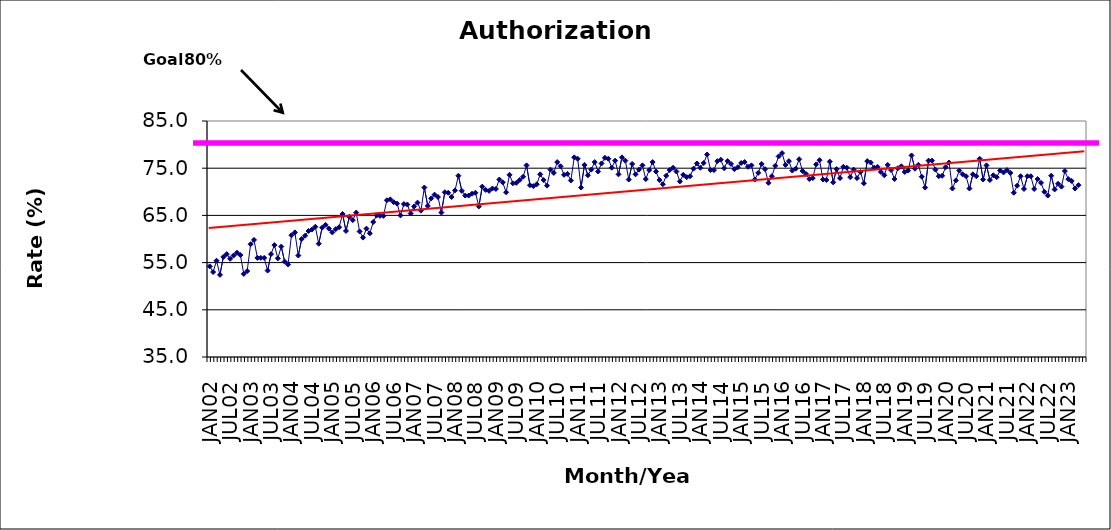
| Category | Series 0 |
|---|---|
| JAN02 | 54.2 |
| FEB02 | 53 |
| MAR02 | 55.4 |
| APR02 | 52.4 |
| MAY02 | 56.2 |
| JUN02 | 56.8 |
| JUL02 | 55.8 |
| AUG02 | 56.5 |
| SEP02 | 57.1 |
| OCT02 | 56.6 |
| NOV02 | 52.6 |
| DEC02 | 53.2 |
| JAN03 | 58.9 |
| FEB03 | 59.8 |
| MAR03 | 56 |
| APR03 | 56 |
| MAY03 | 56 |
| JUN03 | 53.3 |
| JUL03 | 56.8 |
| AUG03 | 58.7 |
| SEP03 | 55.9 |
| OCT03 | 58.4 |
| NOV03 | 55.2 |
| DEC03 | 54.6 |
| JAN04 | 60.8 |
| FEB04 | 61.4 |
| MAR04 | 56.5 |
| APR04 | 60 |
| MAY04 | 60.7 |
| JUN04 | 61.7 |
| JUL04 | 62 |
| AUG04 | 62.6 |
| SEP04 | 59 |
| OCT04 | 62.4 |
| NOV04 | 63 |
| DEC04 | 62.2 |
| JAN05 | 61.4 |
| FEB05 | 62.1 |
| MAR05 | 62.5 |
| APR05 | 65.3 |
| MAY05 | 61.7 |
| JUN05 | 64.7 |
| JUL05 | 64 |
| AUG05 | 65.6 |
| SEP05 | 61.6 |
| OCT05 | 60.3 |
| NOV05 | 62.2 |
| DEC05 | 61.2 |
| JAN06 | 63.6 |
| FEB06 | 65 |
| MAR06 | 64.9 |
| APR06 | 64.9 |
| MAY06 | 68.2 |
| JUN06 | 68.4 |
| JUL06 | 67.8 |
| AUG06 | 67.5 |
| SEP06 | 65 |
| OCT06 | 67.4 |
| NOV06 | 67.3 |
| DEC06 | 65.4 |
| JAN07 | 66.9 |
| FEB07 | 67.7 |
| MAR07 | 66 |
| APR07 | 70.9 |
| MAY07 | 67 |
| JUN07 | 68.6 |
| JUL07 | 69.4 |
| AUG07 | 68.9 |
| SEP07 | 65.6 |
| OCT07 | 69.9 |
| NOV07 | 69.8 |
| DEC07 | 68.9 |
| JAN08 | 70.3 |
| FEB08 | 73.4 |
| MAR08 | 70.2 |
| APR08 | 69.2 |
| MAY08 | 69.2 |
| JUN08 | 69.6 |
| JUL08 | 69.8 |
| AUG08 | 66.9 |
| SEP08 | 71.1 |
| OCT08 | 70.4 |
| NOV08 | 70.2 |
| DEC08 | 70.7 |
| JAN09 | 70.6 |
| FEB09 | 72.6 |
| MAR09 | 72 |
| APR09 | 69.9 |
| MAY09 | 73.6 |
| JUN09 | 71.8 |
| JUL09 | 71.9 |
| AUG09 | 72.5 |
| SEP09 | 73.2 |
| OCT09 | 75.6 |
| NOV09 | 71.4 |
| DEC09 | 71.2 |
| JAN10 | 71.6 |
| FEB10 | 73.7 |
| MAR10 | 72.5 |
| APR10 | 71.3 |
| MAY10 | 74.7 |
| JUN10 | 74 |
| JUL10 | 76.3 |
| AUG10 | 75.4 |
| SEP10 | 73.6 |
| OCT10 | 73.8 |
| NOV10 | 72.4 |
| DEC10 | 77.3 |
| JAN11 | 77 |
| FEB11 | 70.9 |
| MAR11 | 75.7 |
| APR11 | 73.5 |
| MAY11 | 74.7 |
| JUN11 | 76.3 |
| JUL11 | 74.3 |
| AUG11 | 76 |
| SEP11 | 77.2 |
| OCT11 | 77 |
| NOV11 | 75.1 |
| DEC11 | 76.6 |
| JAN12 | 73.7 |
| FEB12 | 77.3 |
| MAR12 | 76.6 |
| APR12 | 72.6 |
| MAY12 | 75.9 |
| JUN12 | 73.7 |
| JUL12 | 74.7 |
| AUG12 | 75.6 |
| SEP12 | 72.7 |
| OCT12 | 74.6 |
| NOV12 | 76.3 |
| DEC12 | 74.3 |
| JAN13 | 72.5 |
| FEB13 | 71.6 |
| MAR13 | 73.4 |
| APR13 | 74.6 |
| MAY13 | 75.1 |
| JUN13 | 74.3 |
| JUL13 | 72.2 |
| AUG13 | 73.6 |
| SEP13 | 73.1 |
| OCT13 | 73.3 |
| NOV13 | 74.9 |
| DEC13 | 76 |
| JAN14 | 75.1 |
| FEB14 | 76.1 |
| MAR14 | 77.9 |
| APR14 | 74.6 |
| MAY14 | 74.6 |
| JUN14 | 76.5 |
| JUL14 | 76.8 |
| AUG14 | 75 |
| SEP14 | 76.5 |
| OCT14 | 75.9 |
| NOV14 | 74.8 |
| DEC14 | 75.2 |
| JAN15 | 76.1 |
| FEB15 | 76.3 |
| MAR15 | 75.3 |
| APR15 | 75.6 |
| MAY15 | 72.6 |
| JUN15 | 74 |
| JUL15 | 75.9 |
| AUG15 | 74.8 |
| SEP15 | 71.9 |
| OCT15 | 73.3 |
| NOV15 | 75.5 |
| DEC15 | 77.5 |
| JAN16 | 78.2 |
| FEB16 | 75.7 |
| MAR16 | 76.5 |
| APR16 | 74.5 |
| MAY16 | 74.9 |
| JUN16 | 76.9 |
| JUL16 | 74.4 |
| AUG16 | 73.8 |
| SEP16 | 72.7 |
| OCT16 | 72.9 |
| NOV16 | 75.8 |
| DEC16 | 76.7 |
| JAN17 | 72.6 |
| FEB17 | 72.5 |
| MAR17 | 76.4 |
| APR17 | 72 |
| MAY17 | 74.8 |
| JUN17 | 72.9 |
| JUL17 | 75.3 |
| AUG17 | 75.1 |
| SEP17 | 73.1 |
| OCT17 | 74.7 |
| NOV17 | 72.9 |
| DEC17 | 74.2 |
| JAN18 | 71.8 |
| FEB18 | 76.5 |
| MAR18 | 76.2 |
| APR18 | 75.1 |
| MAY18 | 75.3 |
| JUN18 | 74.2 |
| JUL18 | 73.5 |
| AUG18 | 75.7 |
| SEP18 | 74.6 |
| OCT18 | 72.7 |
| NOV18 | 75 |
| DEC18 | 75.4 |
| JAN19 | 74.2 |
| FEB19 | 74.5 |
| MAR19 | 77.7 |
| APR19 | 74.9 |
| MAY19 | 75.7 |
| JUN19 | 73.2 |
| JUL19 | 70.9 |
| AUG19 | 76.6 |
| SEP19 | 76.6 |
| OCT19 | 74.7 |
| NOV19 | 73.3 |
| DEC19 | 73.4 |
| JAN20 | 75.2 |
| FEB20 | 76.2 |
| MAR20 | 70.7 |
| APR20 | 72.4 |
| MAY20 | 74.5 |
| JUN20 | 73.7 |
| JUL20 | 73.3 |
| AUG20 | 70.7 |
| SEP20 | 73.7 |
| OCT20 | 73.3 |
| NOV20 | 77 |
| DEC20 | 72.6 |
| JAN21 | 75.6 |
| FEB21 | 72.5 |
| MAR21 | 73.5 |
| APR21 | 73.1 |
| MAY21 | 74.5 |
| JUN21 | 74.1 |
| JUL21 | 74.6 |
| AUG21 | 74 |
| SEP21 | 69.8 |
| OCT21 | 71.3 |
| NOV21 | 73.3 |
| DEC21 | 70.6 |
| JAN22 | 73.3 |
| FEB22 | 73.3 |
| MAR22 | 70.6 |
| APR22 | 72.7 |
| MAY22 | 71.9 |
| JUN22 | 70 |
| JUL22 | 69.2 |
| AUG22 | 73.4 |
| SEP22 | 70.5 |
| OCT22 | 71.7 |
| NOV22 | 71.1 |
| DEC22 | 74.4 |
| JAN23 | 72.7 |
| FEB23 | 72.3 |
| MAR23 | 70.7 |
| APR23 | 71.4 |